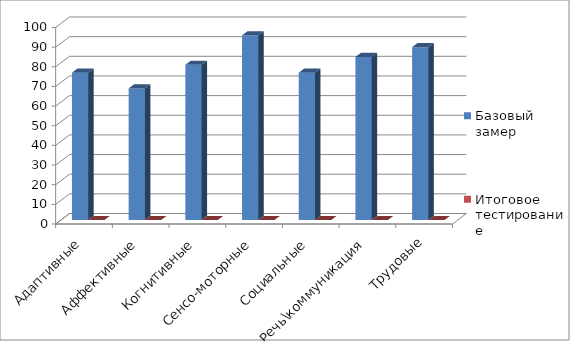
| Category | Базовый замер | Итоговое тестирование |
|---|---|---|
| Адаптивные | 75 | 0 |
| Аффективные | 67 | 0 |
| Когнитивные | 79 | 0 |
| Сенсо-моторные | 94 | 0 |
| Социальные | 75 | 0 |
| Речь\коммуникация | 83 | 0 |
| Трудовые | 88 | 0 |